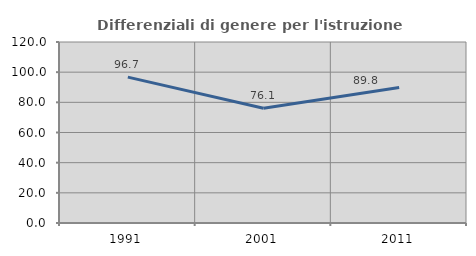
| Category | Differenziali di genere per l'istruzione superiore |
|---|---|
| 1991.0 | 96.705 |
| 2001.0 | 76.113 |
| 2011.0 | 89.789 |